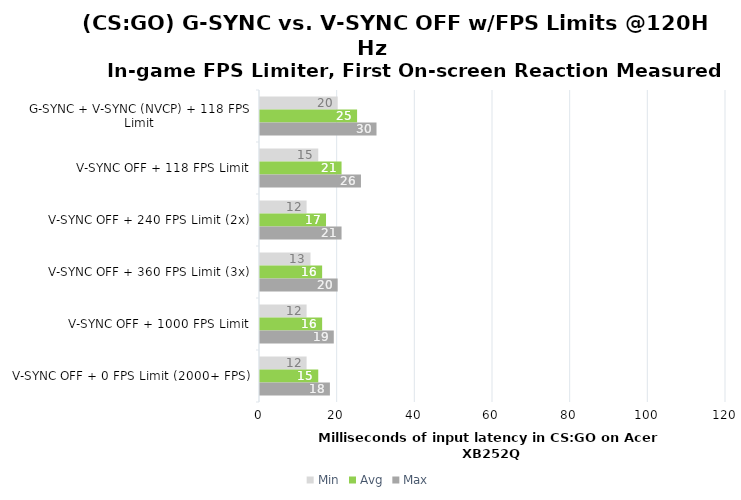
| Category | Min | Avg | Max |
|---|---|---|---|
| G-SYNC + V-SYNC (NVCP) + 118 FPS Limit | 20 | 25 | 30 |
| V-SYNC OFF + 118 FPS Limit | 15 | 21 | 26 |
| V-SYNC OFF + 240 FPS Limit (2x) | 12 | 17 | 21 |
| V-SYNC OFF + 360 FPS Limit (3x) | 13 | 16 | 20 |
| V-SYNC OFF + 1000 FPS Limit | 12 | 16 | 19 |
| V-SYNC OFF + 0 FPS Limit (2000+ FPS) | 12 | 15 | 18 |